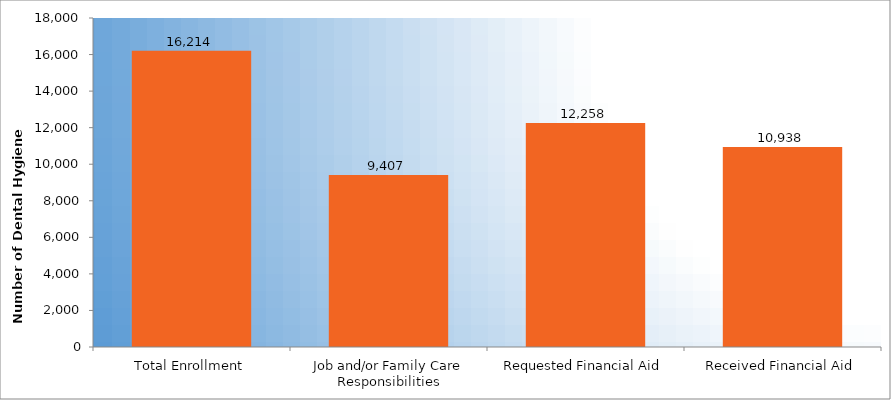
| Category | Number of Dental Hygiene Students |
|---|---|
| Total Enrollment | 16214 |
| Job and/or Family Care Responsibilities | 9407 |
| Requested Financial Aid | 12258 |
| Received Financial Aid | 10938 |